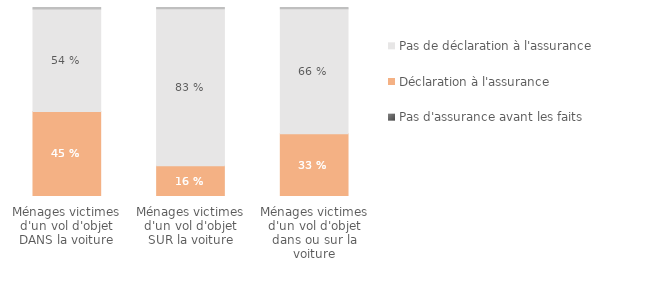
| Category | Pas d'assurance avant les faits | Déclaration à l'assurance | Pas de déclaration à l'assurance | Ne sait pas/Refus |
|---|---|---|---|---|
| Ménages victimes d'un vol d'objet dans ou sur la voiture | 0 | 0.332 | 0.661 | 0.006 |
| Ménages victimes d'un vol d'objet SUR la voiture | 0 | 0.162 | 0.83 | 0.007 |
| Ménages victimes d'un vol d'objet DANS la voiture | 0 | 0.45 | 0.542 | 0.007 |